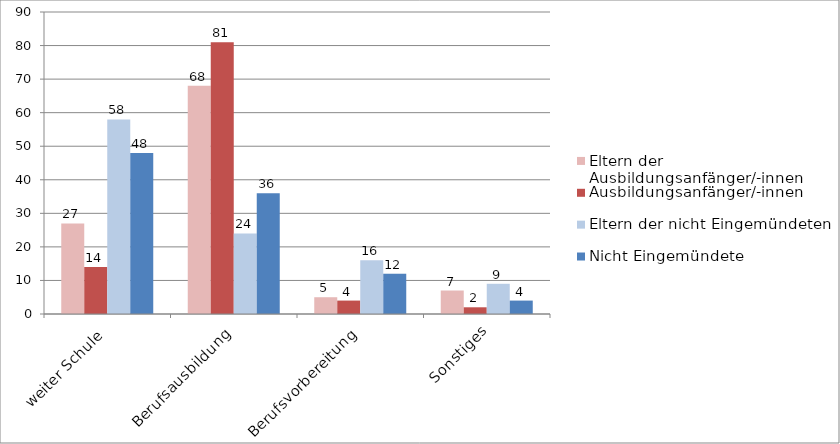
| Category | Eltern der Ausbildungsanfänger/-innen | Ausbildungsanfänger/-innen | Eltern der nicht Eingemündeten | Nicht Eingemündete |
|---|---|---|---|---|
| weiter Schule | 27 | 14 | 58 | 48 |
| Berufsausbildung | 68 | 81 | 24 | 36 |
| Berufsvorbereitung | 5 | 4 | 16 | 12 |
| Sonstiges | 7 | 2 | 9 | 4 |